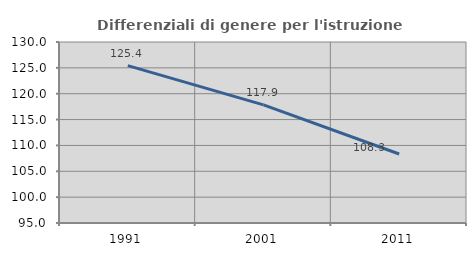
| Category | Differenziali di genere per l'istruzione superiore |
|---|---|
| 1991.0 | 125.42 |
| 2001.0 | 117.852 |
| 2011.0 | 108.342 |